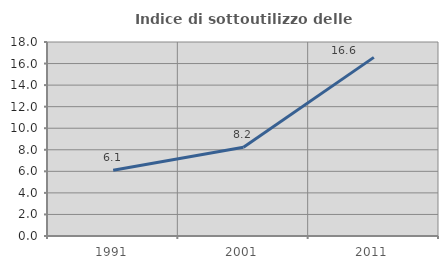
| Category | Indice di sottoutilizzo delle abitazioni  |
|---|---|
| 1991.0 | 6.098 |
| 2001.0 | 8.228 |
| 2011.0 | 16.575 |